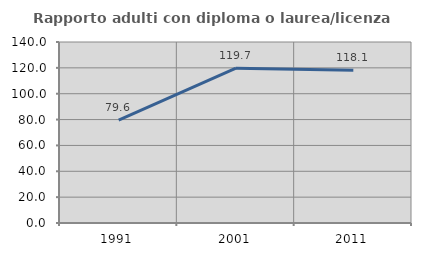
| Category | Rapporto adulti con diploma o laurea/licenza media  |
|---|---|
| 1991.0 | 79.635 |
| 2001.0 | 119.722 |
| 2011.0 | 118.095 |